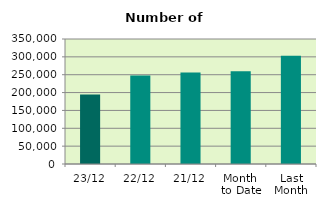
| Category | Series 0 |
|---|---|
| 23/12 | 194378 |
| 22/12 | 248098 |
| 21/12 | 255998 |
| Month 
to Date | 259699.294 |
| Last
Month | 303258.727 |